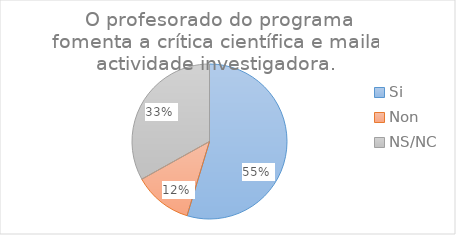
| Category | Series 25 |
|---|---|
| Si | 76 |
| Non | 17 |
| NS/NC | 46 |